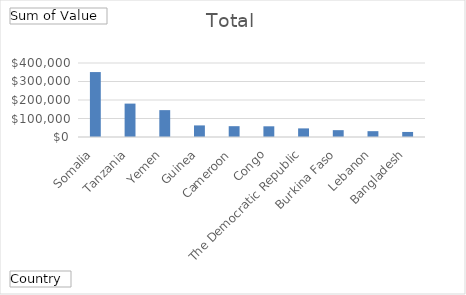
| Category | Total |
|---|---|
| Somalia | 351000 |
| Tanzania | 180525 |
| Yemen | 145250 |
| Guinea | 62640 |
| Cameroon | 58500 |
| Congo, The Democratic Republic | 57812.5 |
| Burkina Faso | 46530 |
| Lebanon | 36960 |
| Bangladesh | 31502.71 |
| Turkiye | 27300 |